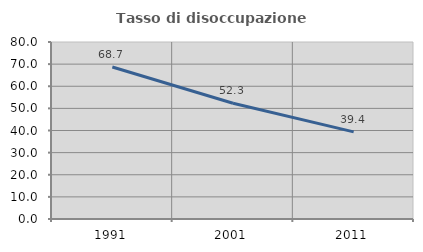
| Category | Tasso di disoccupazione giovanile  |
|---|---|
| 1991.0 | 68.702 |
| 2001.0 | 52.294 |
| 2011.0 | 39.362 |